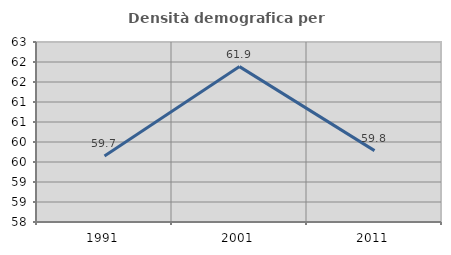
| Category | Densità demografica |
|---|---|
| 1991.0 | 59.652 |
| 2001.0 | 61.885 |
| 2011.0 | 59.785 |